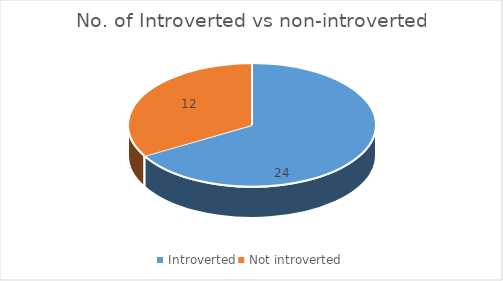
| Category | Series 0 |
|---|---|
| Introverted | 24 |
| Not introverted | 12 |